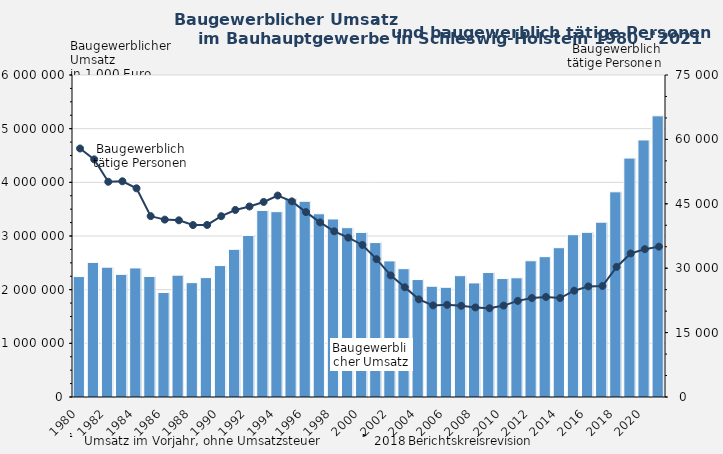
| Category | Baugewerblicher 
Umsatz in 1000 Euro |
|---|---|
| 1980.0 | 2243938 |
| 1981.0 | 2507741 |
| 1982.0 | 2419292 |
| 1983.0 | 2285011 |
| 1984.0 | 2404975 |
| 1985.0 | 2245931 |
| 1986.0 | 1947650 |
| 1987.0 | 2270584 |
| 1988.0 | 2130717 |
| 1989.0 | 2224899 |
| 1990.0 | 2449116 |
| 1991.0 | 2751377 |
| 1992.0 | 3010338 |
| 1993.0 | 3476875 |
| 1994.0 | 3453560 |
| 1995.0 | 3703125 |
| 1996.0 | 3646830 |
| 1997.0 | 3414109 |
| 1998.0 | 3317273 |
| 1999.0 | 3154963 |
| 2000.0 | 3067211 |
| 2001.0 | 2877358 |
| 2002.0 | 2536088 |
| 2003.0 | 2391237 |
| 2004.0 | 2188519 |
| 2005.0 | 2064179 |
| 2006.0 | 2044588 |
| 2007.0 | 2260543 |
| 2008.0 | 2125896 |
| 2009.0 | 2319249 |
| 2010.0 | 2207465 |
| 2011.0 | 2220922 |
| 2012.0 | 2538836 |
| 2013.0 | 2615095 |
| 2014.0 | 2781930 |
| 2015.0 | 3024321 |
| 2016.0 | 3068162 |
| 2017.0 | 3257770 |
| 2018.0 | 3823207 |
| 2019.0 | 4452522 |
| 2020.0 | 4789743 |
| 2021.0 | 5239511 |